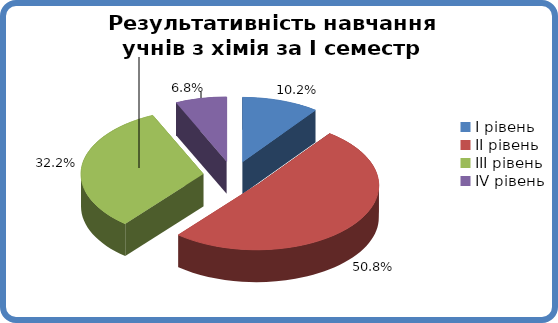
| Category | Series 0 |
|---|---|
| 0 | 0.102 |
| 1 | 0.508 |
| 2 | 0.322 |
| 3 | 0.068 |